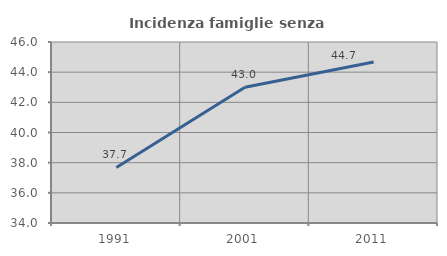
| Category | Incidenza famiglie senza nuclei |
|---|---|
| 1991.0 | 37.681 |
| 2001.0 | 43 |
| 2011.0 | 44.67 |